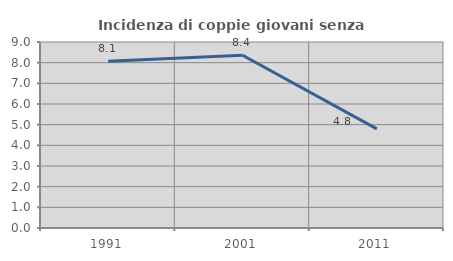
| Category | Incidenza di coppie giovani senza figli |
|---|---|
| 1991.0 | 8.063 |
| 2001.0 | 8.357 |
| 2011.0 | 4.797 |